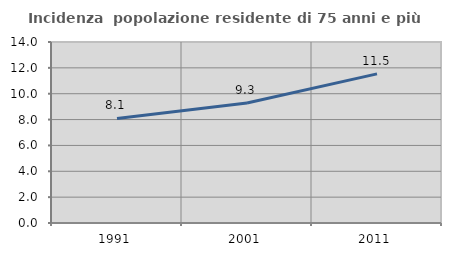
| Category | Incidenza  popolazione residente di 75 anni e più |
|---|---|
| 1991.0 | 8.09 |
| 2001.0 | 9.278 |
| 2011.0 | 11.533 |